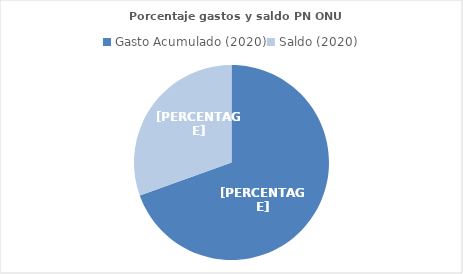
| Category | Series 0 |
|---|---|
| Gasto Acumulado (2020) | 2779895.27 |
| Saldo (2020) | 1220104.126 |